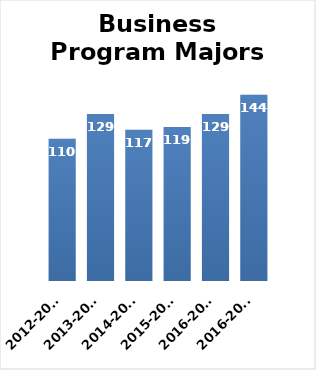
| Category | Series 0 |
|---|---|
| 2012-2013 | 110 |
| 2013-2014 | 129 |
| 2014-2015 | 117 |
| 2015-2016 | 119 |
| 2016-2017 | 129 |
| 2016-2017 | 144 |